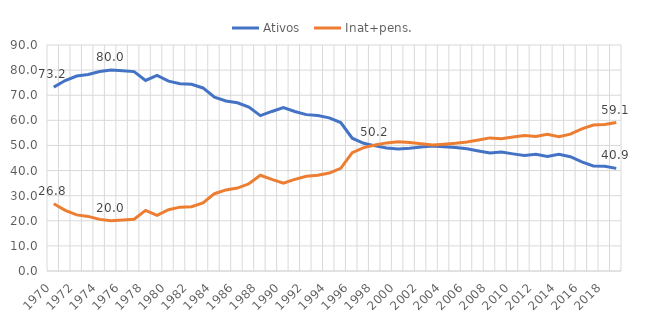
| Category | Ativos  | Inat+pens. |
|---|---|---|
| 1970.0 | 73.236 | 26.764 |
| 1971.0 | 75.846 | 24.154 |
| 1972.0 | 77.648 | 22.352 |
| 1973.0 | 78.263 | 21.737 |
| 1974.0 | 79.443 | 20.557 |
| 1975.0 | 79.994 | 20.006 |
| 1976.0 | 79.699 | 20.301 |
| 1977.0 | 79.408 | 20.592 |
| 1978.0 | 75.871 | 24.129 |
| 1979.0 | 77.857 | 22.143 |
| 1980.0 | 75.607 | 24.393 |
| 1981.0 | 74.573 | 25.427 |
| 1982.0 | 74.379 | 25.621 |
| 1983.0 | 72.894 | 27.106 |
| 1984.0 | 69.218 | 30.782 |
| 1985.0 | 67.707 | 32.293 |
| 1986.0 | 66.985 | 33.015 |
| 1987.0 | 65.27 | 34.73 |
| 1988.0 | 61.891 | 38.109 |
| 1989.0 | 63.534 | 36.466 |
| 1990.0 | 65.054 | 34.946 |
| 1991.0 | 63.504 | 36.496 |
| 1992.0 | 62.272 | 37.728 |
| 1993.0 | 61.887 | 38.113 |
| 1994.0 | 60.981 | 39.019 |
| 1995.0 | 59.121 | 40.879 |
| 1996.0 | 52.877 | 47.123 |
| 1997.0 | 50.844 | 49.156 |
| 1998.0 | 49.82 | 50.18 |
| 1999.0 | 48.983 | 51.017 |
| 2000.0 | 48.543 | 51.457 |
| 2001.0 | 48.875 | 51.125 |
| 2002.0 | 49.34 | 50.66 |
| 2003.0 | 49.804 | 50.196 |
| 2004.0 | 49.48 | 50.52 |
| 2005.0 | 49.139 | 50.861 |
| 2006.0 | 48.661 | 51.339 |
| 2007.0 | 47.813 | 52.187 |
| 2008.0 | 46.994 | 53.006 |
| 2009.0 | 47.341 | 52.659 |
| 2010.0 | 46.647 | 53.353 |
| 2011.0 | 46.019 | 53.981 |
| 2012.0 | 46.441 | 53.559 |
| 2013.0 | 45.575 | 54.425 |
| 2014.0 | 46.511 | 53.489 |
| 2015.0 | 45.499 | 54.501 |
| 2016.0 | 43.424 | 56.576 |
| 2017.0 | 41.852 | 58.148 |
| 2018.0 | 41.698 | 58.302 |
| 2019.0 | 40.876 | 59.124 |